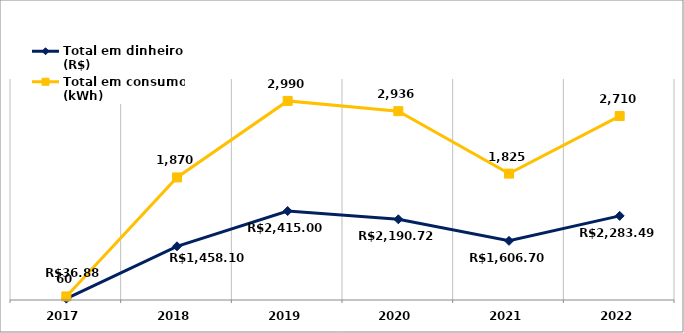
| Category | Total em dinheiro (R$) | Total em consumo (kWh) |
|---|---|---|
| 2017.0 | 36.88 | 60 |
| 2018.0 | 1458.1 | 1870 |
| 2019.0 | 2415 | 2990 |
| 2020.0 | 2190.72 | 2936 |
| 2021.0 | 1606.7 | 1825 |
| 2022.0 | 2283.49 | 2710 |